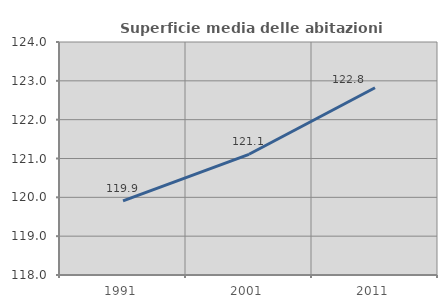
| Category | Superficie media delle abitazioni occupate |
|---|---|
| 1991.0 | 119.909 |
| 2001.0 | 121.108 |
| 2011.0 | 122.822 |